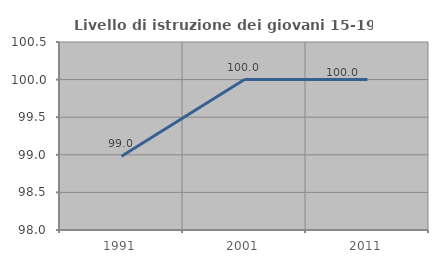
| Category | Livello di istruzione dei giovani 15-19 anni |
|---|---|
| 1991.0 | 98.98 |
| 2001.0 | 100 |
| 2011.0 | 100 |